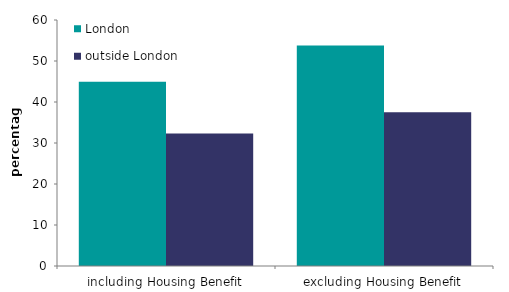
| Category | London | outside London |
|---|---|---|
| including Housing Benefit | 44.932 | 32.312 |
| excluding Housing Benefit | 53.762 | 37.505 |